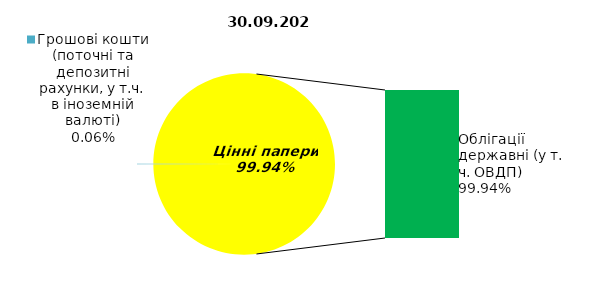
| Category | Series 0 |
|---|---|
| Грошові кошти (поточні та депозитні рахунки, у т.ч. в іноземній валюті) | 0.116 |
| Банківські метали | 0 |
| Нерухомість | 0 |
| Інші активи | 0 |
| Акції | 0 |
| Корпоративні облігації  | 0 |
| Облігації місцевих позик | 0 |
| Облігації державні (у т. ч. ОВДП) | 181.605 |
| Іпотечні сертифікати | 0 |